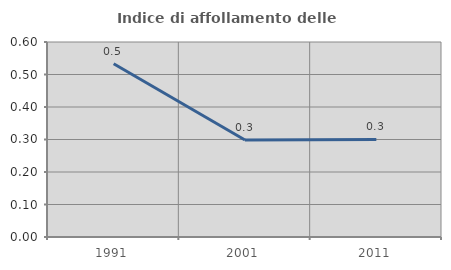
| Category | Indice di affollamento delle abitazioni  |
|---|---|
| 1991.0 | 0.533 |
| 2001.0 | 0.299 |
| 2011.0 | 0.3 |